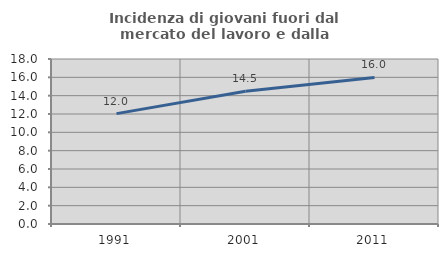
| Category | Incidenza di giovani fuori dal mercato del lavoro e dalla formazione  |
|---|---|
| 1991.0 | 12.041 |
| 2001.0 | 14.479 |
| 2011.0 | 15.985 |